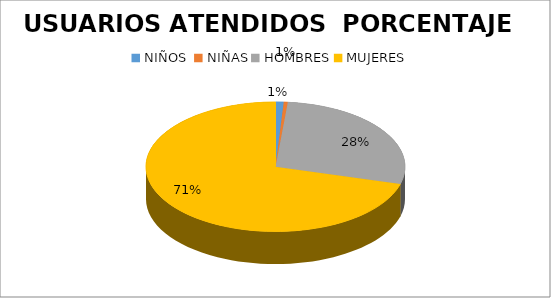
| Category | USUARIOS ATENDIDOS  PORCENTAJE | USUARIOS ATENDIDOS  CANTIDAD |
|---|---|---|
| NIÑOS  | 1.01 | 2 |
| NIÑAS | 0.505 | 1 |
| HOMBRES | 27.778 | 55 |
| MUJERES | 70.707 | 140 |